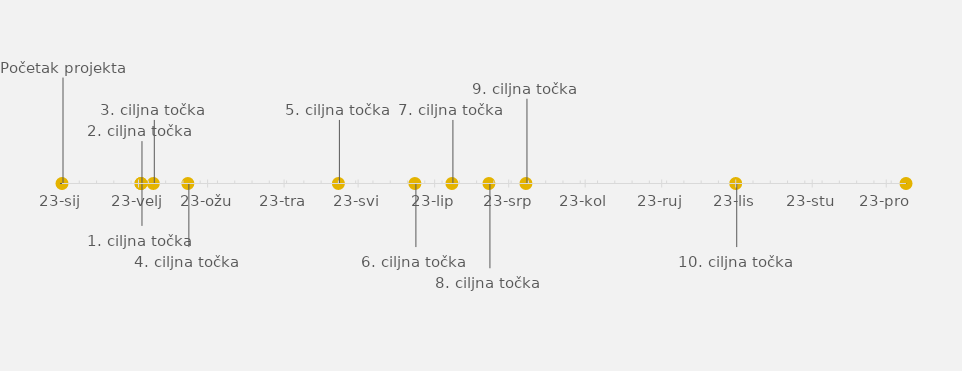
| Category | POLOŽAJ |
|---|---|
| Početak projekta | 25 |
| 1. ciljna točka | -10 |
| 2. ciljna točka | 10 |
| 3. ciljna točka | 15 |
| 4. ciljna točka | -15 |
| 5. ciljna točka | 15 |
| 6. ciljna točka | -15 |
| 7. ciljna točka | 15 |
| 8. ciljna točka | -20 |
| 9. ciljna točka | 20 |
| 10. ciljna točka | -15 |
| Završetak projekta | 15 |